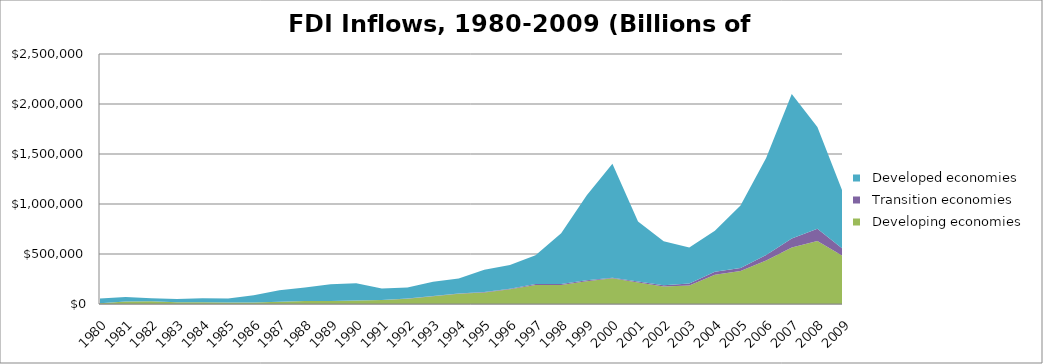
| Category |   Developing economies |   Transition economies |   Developed economies |
|---|---|---|---|
| 1980 | 7477.013 | 23.6 | 46575.809 |
| 1981 | 24042.779 | 12.6 | 45511.799 |
| 1982 | 26376.824 | 0.3 | 31682.121 |
| 1983 | 17569.499 | 18 | 32680.27 |
| 1984 | 17609.795 | -8 | 39237.131 |
| 1985 | 14153.748 | 15 | 41663.202 |
| 1986 | 15716.366 | -28 | 70628.039 |
| 1987 | 21725.322 | 7 | 114843.202 |
| 1988 | 30309.82 | 22.4 | 133580.43 |
| 1989 | 30821.961 | 18.3 | 166528.434 |
| 1990 | 35095.646 | 75.2 | 172526.338 |
| 1991 | 39770.016 | 203.52 | 114035.445 |
| 1992 | 53167.229 | 1664.081 | 111141.277 |
| 1993 | 76834.548 | 3169.114 | 143450.765 |
| 1994 | 103501.672 | 2050.169 | 150560.041 |
| 1995 | 115943.162 | 4112.567 | 222488.469 |
| 1996 | 147077.799 | 5885.122 | 236035.245 |
| 1997 | 190723.95 | 10347.812 | 285404.419 |
| 1998 | 190729.497 | 8035.066 | 508420.624 |
| 1999 | 228079.387 | 8452.114 | 850968.785 |
| 2000 | 256465.225 | 7024.929 | 1137976.255 |
| 2001 | 214696.485 | 9514.027 | 601069.828 |
| 2002 | 176063.059 | 11273.464 | 440777.592 |
| 2003 | 183911.74 | 19909.824 | 361917.45 |
| 2004 | 291919.077 | 30410.589 | 410066.947 |
| 2005 | 330129.875 | 31100.637 | 624565.13 |
| 2006 | 434365.874 | 54669.267 | 970098.142 |
| 2007 | 564929.901 | 90968.229 | 1444074.78 |
| 2008 | 630012.532 | 122587.773 | 1018272.536 |
| 2009 | 478349.041 | 69948.285 | 565891.994 |